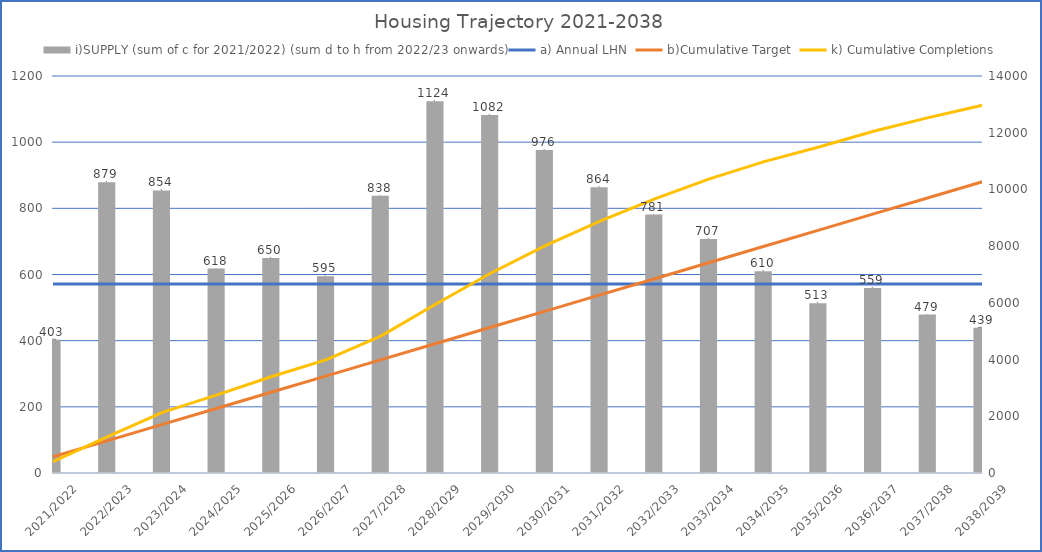
| Category | i)SUPPLY (sum of c for 2021/2022) (sum d to h from 2022/23 onwards) |
|---|---|
| 2021/2022 | 403 |
| 2022/2023 | 879 |
| 2023/2024 | 854 |
| 2024/2025 | 618 |
| 2025/2026 | 650 |
| 2026/2027 | 595 |
| 2027/2028 | 838 |
| 2028/2029 | 1124 |
| 2029/2030 | 1082 |
| 2030/2031 | 976 |
| 2031/2032 | 864 |
| 2032/2033 | 781 |
| 2033/2034 | 707 |
| 2034/2035 | 610 |
| 2035/2036 | 513 |
| 2036/2037 | 559 |
| 2037/2038 | 479 |
| 2038/2039 | 439 |